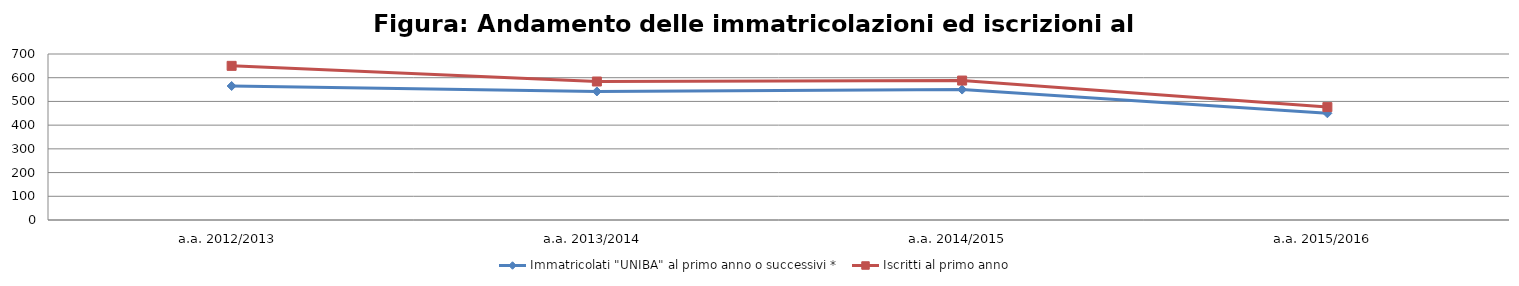
| Category | Immatricolati "UNIBA" al primo anno o successivi * | Iscritti al primo anno  |
|---|---|---|
| a.a. 2012/2013 | 565 | 650 |
| a.a. 2013/2014 | 542 | 584 |
| a.a. 2014/2015 | 550 | 588 |
| a.a. 2015/2016 | 450 | 476 |